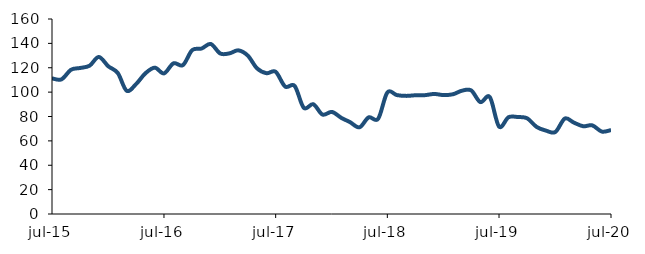
| Category | Series 0 |
|---|---|
| 2015-07-01 | 111.301 |
| 2015-08-01 | 110.476 |
| 2015-09-01 | 118.342 |
| 2015-10-01 | 119.81 |
| 2015-11-01 | 121.711 |
| 2015-12-01 | 128.863 |
| 2016-01-01 | 121.209 |
| 2016-02-01 | 115.694 |
| 2016-03-01 | 101.131 |
| 2016-04-01 | 106.659 |
| 2016-05-01 | 115.39 |
| 2016-06-01 | 120.08 |
| 2016-07-01 | 115.372 |
| 2016-08-01 | 123.627 |
| 2016-09-01 | 122.173 |
| 2016-10-01 | 134.411 |
| 2016-11-01 | 135.774 |
| 2016-12-01 | 139.499 |
| 2017-01-01 | 131.686 |
| 2017-02-01 | 131.88 |
| 2017-03-01 | 134.273 |
| 2017-04-01 | 129.955 |
| 2017-05-01 | 119.538 |
| 2017-06-01 | 115.527 |
| 2017-07-01 | 116.683 |
| 2017-08-01 | 104.546 |
| 2017-09-01 | 105.103 |
| 2017-10-01 | 87.108 |
| 2017-11-01 | 90.075 |
| 2017-12-01 | 81.601 |
| 2018-01-01 | 83.754 |
| 2018-02-01 | 78.808 |
| 2018-03-01 | 75.392 |
| 2018-04-01 | 71.126 |
| 2018-05-01 | 79.289 |
| 2018-06-01 | 78.169 |
| 2018-07-01 | 99.684 |
| 2018-08-01 | 97.559 |
| 2018-09-01 | 96.912 |
| 2018-10-01 | 97.418 |
| 2018-11-01 | 97.512 |
| 2018-12-01 | 98.483 |
| 2019-01-01 | 97.592 |
| 2019-02-01 | 98.273 |
| 2019-03-01 | 101.093 |
| 2019-04-01 | 101.417 |
| 2019-05-01 | 91.822 |
| 2019-06-01 | 95.9 |
| 2019-07-01 | 71.746 |
| 2019-08-01 | 79.385 |
| 2019-09-01 | 79.546 |
| 2019-10-01 | 78.535 |
| 2019-11-01 | 71.432 |
| 2019-12-01 | 68.463 |
| 2020-01-01 | 67.272 |
| 2020-02-01 | 78.312 |
| 2020-03-01 | 75.068 |
| 2020-04-01 | 72.017 |
| 2020-05-01 | 72.705 |
| 2020-06-01 | 67.626 |
| 2020-07-01 | 68.877 |